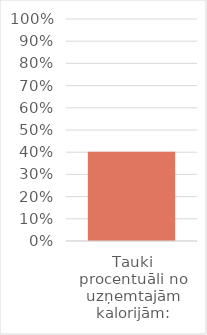
| Category | Series 0 |
|---|---|
| Tauki procentuāli no uzņemtajām kalorijām: | 0.402 |